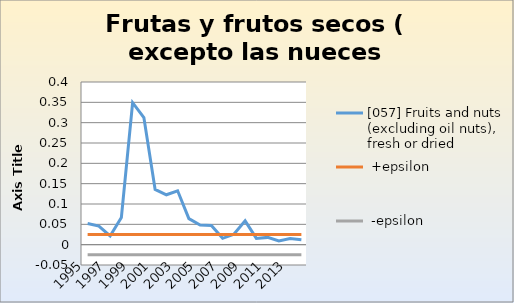
| Category | [057] Fruits and nuts (excluding oil nuts), fresh or dried |  +epsilon |  -epsilon |
|---|---|---|---|
| 1995.0 | 0.052 | 0.025 | -0.025 |
| 1996.0 | 0.046 | 0.025 | -0.025 |
| 1997.0 | 0.021 | 0.025 | -0.025 |
| 1998.0 | 0.067 | 0.025 | -0.025 |
| 1999.0 | 0.349 | 0.025 | -0.025 |
| 2000.0 | 0.313 | 0.025 | -0.025 |
| 2001.0 | 0.136 | 0.025 | -0.025 |
| 2002.0 | 0.123 | 0.025 | -0.025 |
| 2003.0 | 0.132 | 0.025 | -0.025 |
| 2004.0 | 0.064 | 0.025 | -0.025 |
| 2005.0 | 0.048 | 0.025 | -0.025 |
| 2006.0 | 0.047 | 0.025 | -0.025 |
| 2007.0 | 0.016 | 0.025 | -0.025 |
| 2008.0 | 0.025 | 0.025 | -0.025 |
| 2009.0 | 0.059 | 0.025 | -0.025 |
| 2010.0 | 0.015 | 0.025 | -0.025 |
| 2011.0 | 0.018 | 0.025 | -0.025 |
| 2012.0 | 0.009 | 0.025 | -0.025 |
| 2013.0 | 0.015 | 0.025 | -0.025 |
| 2014.0 | 0.012 | 0.025 | -0.025 |